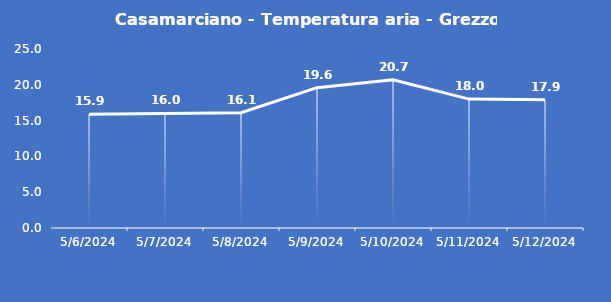
| Category | Casamarciano - Temperatura aria - Grezzo (°C) |
|---|---|
| 5/6/24 | 15.9 |
| 5/7/24 | 16 |
| 5/8/24 | 16.1 |
| 5/9/24 | 19.6 |
| 5/10/24 | 20.7 |
| 5/11/24 | 18 |
| 5/12/24 | 17.9 |